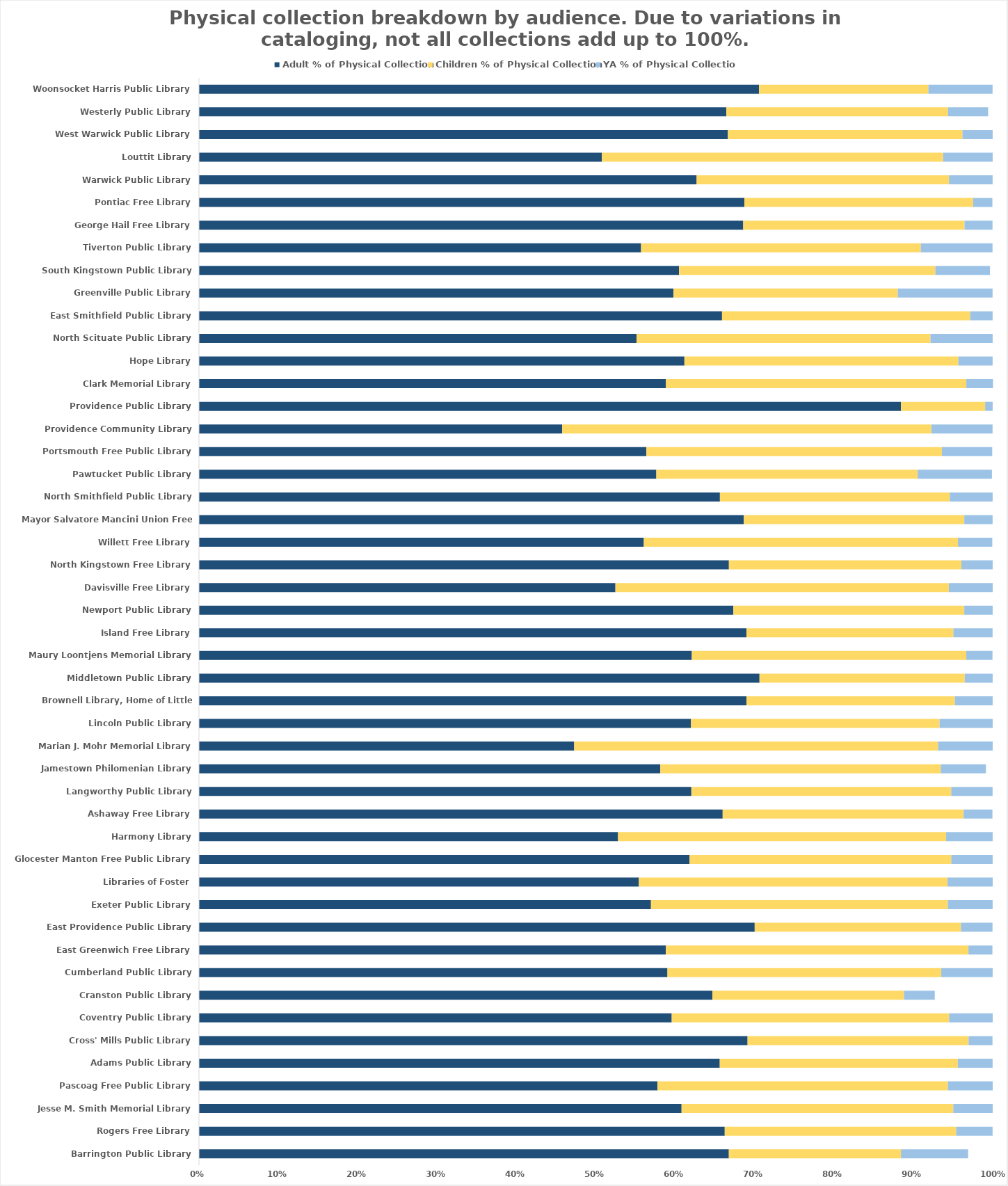
| Category | Adult % of Physical Collection | Children % of Physical Collection | YA % of Physical Collection |
|---|---|---|---|
| Barrington Public Library | 0.668 | 0.217 | 0.085 |
| Rogers Free Library | 0.662 | 0.292 | 0.046 |
| Jesse M. Smith Memorial Library | 0.608 | 0.342 | 0.05 |
| Pascoag Free Public Library | 0.578 | 0.366 | 0.056 |
| Adams Public Library | 0.656 | 0.3 | 0.044 |
| Cross' Mills Public Library | 0.691 | 0.279 | 0.03 |
| Coventry Public Library | 0.596 | 0.35 | 0.055 |
| Cranston Public Library | 0.647 | 0.241 | 0.039 |
| Cumberland Public Library | 0.59 | 0.345 | 0.065 |
| East Greenwich Free Library | 0.588 | 0.381 | 0.03 |
| East Providence Public Library | 0.7 | 0.26 | 0.04 |
| Exeter Public Library | 0.569 | 0.374 | 0.056 |
| Libraries of Foster | 0.554 | 0.389 | 0.057 |
| Glocester Manton Free Public Library | 0.618 | 0.33 | 0.052 |
| Harmony Library | 0.528 | 0.413 | 0.059 |
| Ashaway Free Library | 0.66 | 0.304 | 0.036 |
| Langworthy Public Library | 0.62 | 0.327 | 0.052 |
| Jamestown Philomenian Library | 0.581 | 0.353 | 0.057 |
| Marian J. Mohr Memorial Library | 0.473 | 0.458 | 0.069 |
| Lincoln Public Library | 0.62 | 0.313 | 0.067 |
| Brownell Library, Home of Little Compton | 0.69 | 0.263 | 0.048 |
| Middletown Public Library | 0.706 | 0.259 | 0.035 |
| Maury Loontjens Memorial Library | 0.621 | 0.346 | 0.033 |
| Island Free Library | 0.69 | 0.261 | 0.049 |
| Newport Public Library | 0.673 | 0.291 | 0.036 |
| Davisville Free Library | 0.525 | 0.42 | 0.055 |
| North Kingstown Free Library | 0.668 | 0.293 | 0.039 |
| Willett Free Library | 0.561 | 0.396 | 0.043 |
| Mayor Salvatore Mancini Union Free Library | 0.686 | 0.278 | 0.036 |
| North Smithfield Public Library | 0.656 | 0.29 | 0.054 |
| Pawtucket Public Library | 0.576 | 0.329 | 0.094 |
| Portsmouth Free Public Library | 0.564 | 0.372 | 0.063 |
| Providence Community Library | 0.458 | 0.465 | 0.077 |
| Providence Public Library | 0.884 | 0.106 | 0.009 |
| Clark Memorial Library | 0.588 | 0.378 | 0.034 |
| Hope Library | 0.612 | 0.345 | 0.043 |
| North Scituate Public Library | 0.551 | 0.37 | 0.078 |
| East Smithfield Public Library | 0.659 | 0.313 | 0.028 |
| Greenville Public Library | 0.598 | 0.283 | 0.119 |
| South Kingstown Public Library | 0.605 | 0.323 | 0.069 |
| Tiverton Public Library | 0.557 | 0.352 | 0.09 |
| George Hail Free Library | 0.686 | 0.279 | 0.035 |
| Pontiac Free Library | 0.687 | 0.288 | 0.024 |
| Warwick Public Library | 0.627 | 0.318 | 0.055 |
| Louttit Library | 0.507 | 0.43 | 0.062 |
| West Warwick Public Library | 0.666 | 0.296 | 0.038 |
| Westerly Public Library | 0.664 | 0.279 | 0.051 |
| Woonsocket Harris Public Library | 0.706 | 0.213 | 0.081 |